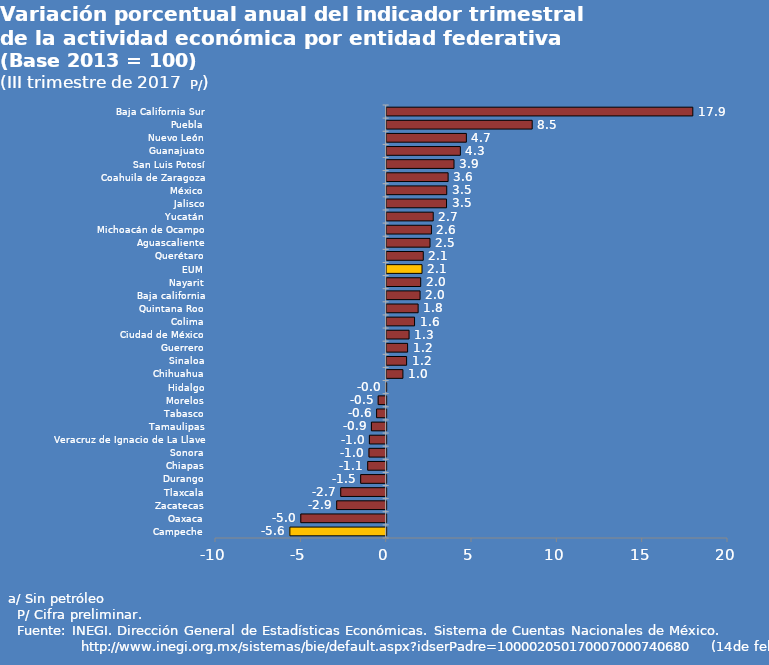
| Category | Series 0 |
|---|---|
| Campeche | -5.642 |
| Oaxaca | -5.001 |
| Zacatecas | -2.898 |
| Tlaxcala | -2.661 |
| Durango | -1.493 |
| Chiapas | -1.081 |
| Sonora | -1.007 |
| Veracruz de Ignacio de La Llave | -0.983 |
| Tamaulipas | -0.864 |
| Tabasco | -0.56 |
| Morelos | -0.468 |
| Hidalgo | -0.037 |
| Chihuahua | 0.952 |
| Sinaloa | 1.169 |
| Guerrero | 1.227 |
| Ciudad de México | 1.312 |
| Colima | 1.634 |
| Quintana Roo | 1.843 |
| Baja california | 1.957 |
| Nayarit | 1.995 |
| EUM | 2.072 |
| Querétaro | 2.145 |
| Aguascaliente | 2.539 |
| Michoacán de Ocampo | 2.624 |
| Yucatán | 2.728 |
| Jalisco | 3.508 |
| México | 3.52 |
| Coahuila de Zaragoza | 3.601 |
| San Luis Potosí | 3.946 |
| Guanajuato | 4.317 |
| Nuevo León | 4.67 |
| Puebla | 8.527 |
| Baja California Sur | 17.939 |